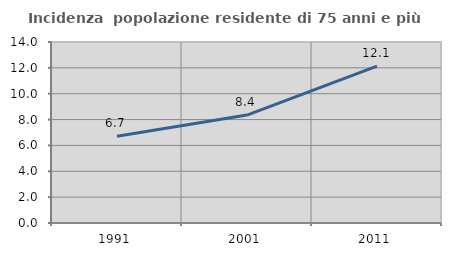
| Category | Incidenza  popolazione residente di 75 anni e più |
|---|---|
| 1991.0 | 6.702 |
| 2001.0 | 8.351 |
| 2011.0 | 12.14 |